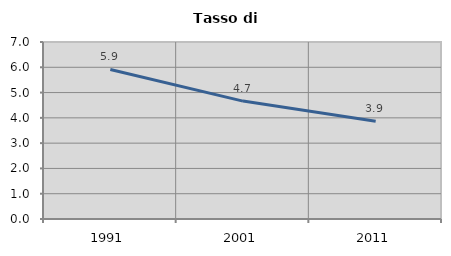
| Category | Tasso di disoccupazione   |
|---|---|
| 1991.0 | 5.914 |
| 2001.0 | 4.663 |
| 2011.0 | 3.868 |